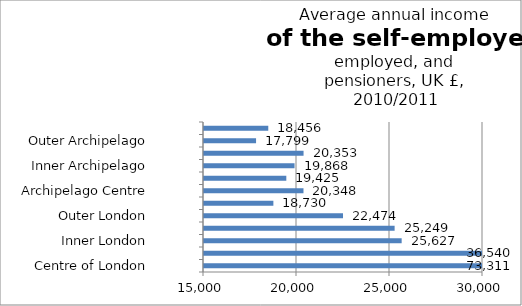
| Category | Series 0 |
|---|---|
| Centre of London | 73310.748 |
| London Core | 36540.04 |
| Inner London | 25626.84 |
| London Suburbs | 25248.508 |
| Outer London | 22473.66 |
| London Edge | 18730 |
| Archipelago Centre | 20348.487 |
| Archipelago Core | 19425.452 |
| Inner Archipelago | 19867.625 |
| Archipelago Suburbs | 20352.527 |
| Outer Archipelago | 17798.871 |
| Archipelago Edge | 18455.911 |